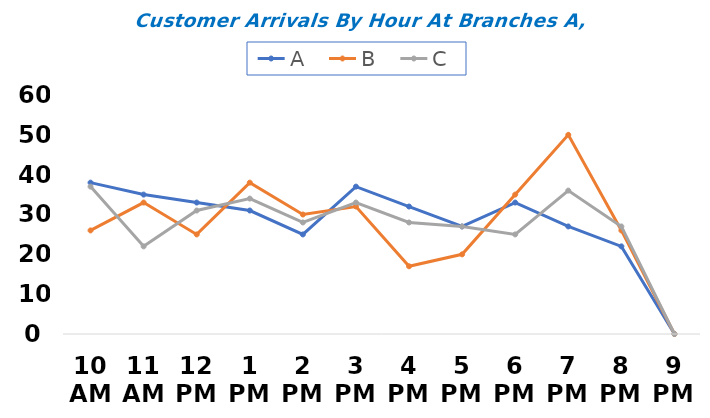
| Category | A | B | C |
|---|---|---|---|
| 10 AM | 38 | 26 | 37 |
| 11 AM | 35 | 33 | 22 |
| 12 PM | 33 | 25 | 31 |
| 1 PM | 31 | 38 | 34 |
| 2 PM | 25 | 30 | 28 |
| 3 PM | 37 | 32 | 33 |
| 4 PM | 32 | 17 | 28 |
| 5 PM | 27 | 20 | 27 |
| 6 PM | 33 | 35 | 25 |
| 7 PM | 27 | 50 | 36 |
| 8 PM | 22 | 26 | 27 |
| 9 PM | 0 | 0 | 0 |